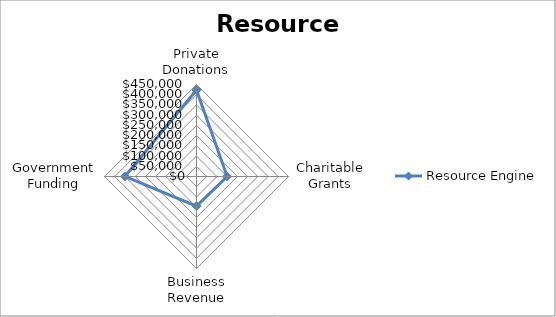
| Category | Resource Engine |
|---|---|
| Private Donations | 422800 |
| Charitable Grants | 150000 |
| Business Revenue | 145000 |
| Government Funding | 350000 |